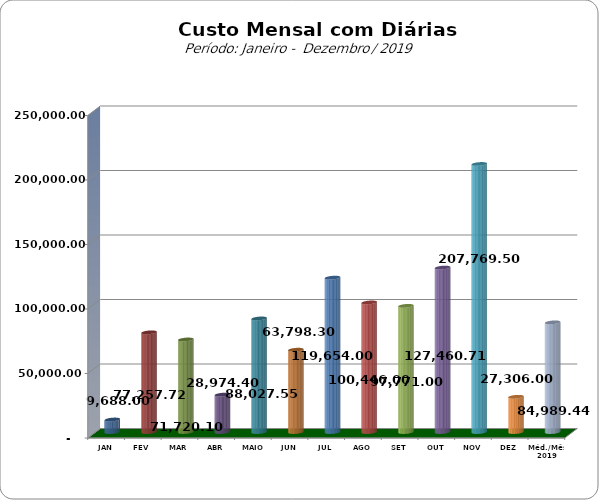
| Category | Series 0 |
|---|---|
| JAN | 9688 |
| FEV | 77257.72 |
| MAR | 71720.1 |
| ABR | 28974.4 |
| MAIO | 88027.55 |
| JUN | 63798.3 |
| JUL | 119654 |
| AGO | 100446 |
| SET | 97771 |
| OUT | 127460.71 |
| NOV | 207769.5 |
| DEZ | 27306 |
| Méd./Mês 2019 | 84989.44 |